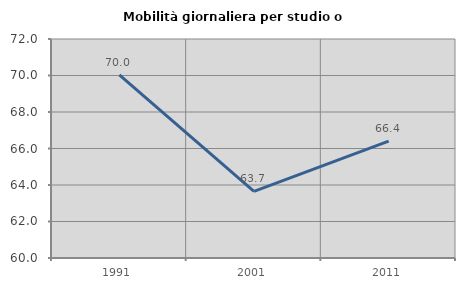
| Category | Mobilità giornaliera per studio o lavoro |
|---|---|
| 1991.0 | 70.031 |
| 2001.0 | 63.655 |
| 2011.0 | 66.4 |